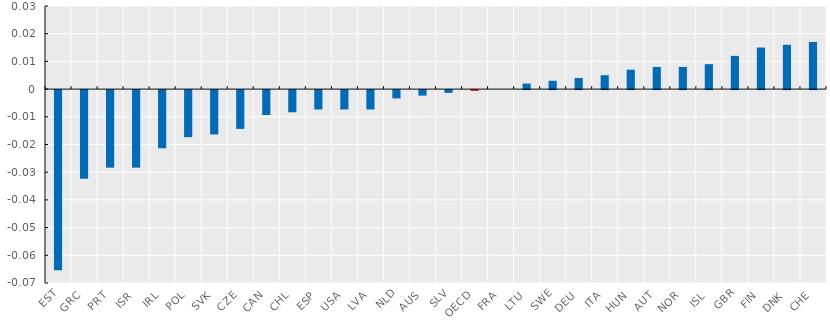
| Category | Series 0 |
|---|---|
| EST | -0.065 |
| GRC | -0.032 |
| PRT | -0.028 |
| ISR | -0.028 |
| IRL | -0.021 |
| POL | -0.017 |
| SVK | -0.016 |
| CZE | -0.014 |
| CAN | -0.009 |
| CHL | -0.008 |
| ESP | -0.007 |
| USA | -0.007 |
| LVA | -0.007 |
| NLD | -0.003 |
| AUS | -0.002 |
| SLV | -0.001 |
| OECD | 0 |
| FRA | 0 |
| LTU | 0.002 |
| SWE | 0.003 |
| DEU | 0.004 |
| ITA | 0.005 |
| HUN | 0.007 |
| AUT | 0.008 |
| NOR | 0.008 |
| ISL | 0.009 |
| GBR | 0.012 |
| FIN | 0.015 |
| DNK | 0.016 |
| CHE | 0.017 |